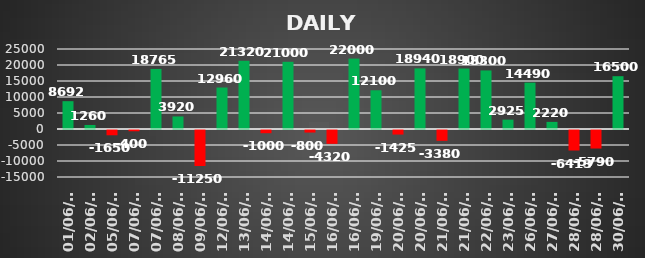
| Category | Series 0 |
|---|---|
| 2023-06-01 | 8692.5 |
| 2023-06-02 | 1260 |
| 2023-06-05 | -1650 |
| 2023-06-07 | -400 |
| 2023-06-07 | 18765 |
| 2023-06-08 | 3920 |
| 2023-06-09 | -11250 |
| 2023-06-12 | 12960 |
| 2023-06-13 | 21320 |
| 2023-06-14 | -1000 |
| 2023-06-14 | 21000 |
| 2023-06-15 | -800 |
| 2023-06-16 | -4320 |
| 2023-06-16 | 22000 |
| 2023-06-19 | 12100 |
| 2023-06-20 | -1425 |
| 2023-06-20 | 18940 |
| 2023-06-21 | -3380 |
| 2023-06-21 | 18900 |
| 2023-06-22 | 18300 |
| 2023-06-23 | 2925 |
| 2023-06-26 | 14490 |
| 2023-06-27 | 2220 |
| 2023-06-28 | -6412.5 |
| 2023-06-28 | -5790 |
| 2023-06-30 | 16500 |